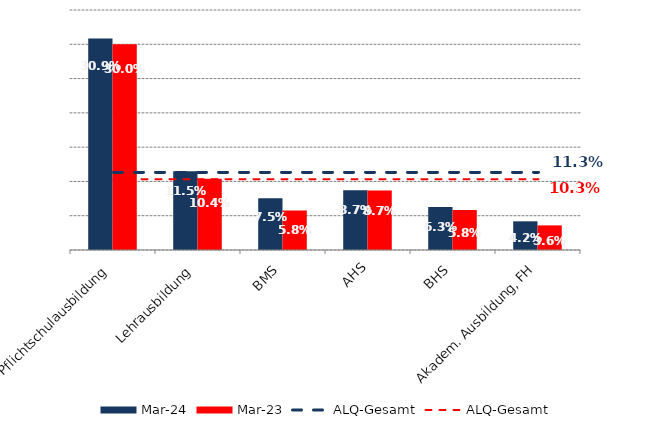
| Category | Mrz 24 | Mrz 23 |
|---|---|---|
| Pflichtschulausbildung | 0.309 | 0.3 |
| Lehrausbildung | 0.115 | 0.104 |
| BMS | 0.075 | 0.058 |
| AHS | 0.087 | 0.087 |
| BHS | 0.063 | 0.058 |
| Akadem. Ausbildung, FH | 0.042 | 0.036 |